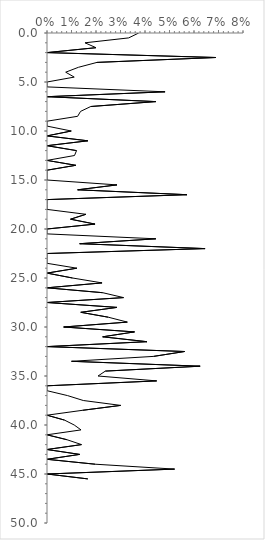
| Category | Series 0 |
|---|---|
| 0.0374331550802139 | 0 |
| 0.03333333333333333 | 0.5 |
| 0.015503875968992248 | 1 |
| 0.02 | 1.5 |
| 0.0 | 2 |
| 0.06896551724137931 | 2.5 |
| 0.02040816326530612 | 3 |
| 0.01282051282051282 | 3.5 |
| 0.007633587786259542 | 4 |
| 0.011111111111111112 | 4.5 |
| 0.0 | 5 |
| 0.0 | 5.5 |
| 0.04819277108433735 | 6 |
| 0.0 | 6.5 |
| 0.044444444444444446 | 7 |
| 0.017857142857142856 | 7.5 |
| 0.0136986301369863 | 8 |
| 0.0125 | 8.5 |
| 0.0 | 9 |
| 0.0 | 9.5 |
| 0.009900990099009901 | 10 |
| 0.0 | 10.5 |
| 0.016666666666666666 | 11 |
| 0.0 | 11.5 |
| 0.012048192771084338 | 12 |
| 0.011235955056179775 | 12.5 |
| 0.0 | 13 |
| 0.011764705882352941 | 13.5 |
| 0.0 | 14 |
| 0.0 | 14.5 |
| 0.0 | 15 |
| 0.02857142857142857 | 15.5 |
| 0.0125 | 16 |
| 0.05714285714285714 | 16.5 |
| 0.0 | 17 |
| 0.0 | 17.5 |
| 0.0 | 18 |
| 0.015873015873015872 | 18.5 |
| 0.009615384615384616 | 19 |
| 0.0196078431372549 | 19.5 |
| 0.0 | 20 |
| 0.0 | 20.5 |
| 0.044444444444444446 | 21 |
| 0.013333333333333334 | 21.5 |
| 0.06451612903225806 | 22 |
| 0.0 | 22.5 |
| 0.0 | 23 |
| 0.0 | 23.5 |
| 0.012195121951219513 | 24 |
| 0.0 | 24.5 |
| 0.010416666666666666 | 25 |
| 0.02247191011235955 | 25.5 |
| 0.0 | 26 |
| 0.022727272727272728 | 26.5 |
| 0.03125 | 27 |
| 0.0 | 27.5 |
| 0.02857142857142857 | 28 |
| 0.013793103448275862 | 28.5 |
| 0.025 | 29 |
| 0.03278688524590164 | 29.5 |
| 0.006802721088435374 | 30 |
| 0.03571428571428571 | 30.5 |
| 0.022727272727272728 | 31 |
| 0.04081632653061224 | 31.5 |
| 0.0 | 32 |
| 0.056179775280898875 | 32.5 |
| 0.043478260869565216 | 33 |
| 0.01 | 33.5 |
| 0.0625 | 34 |
| 0.023809523809523808 | 34.5 |
| 0.020833333333333332 | 35 |
| 0.04477611940298507 | 35.5 |
| 0.0 | 36 |
| 0.0 | 36.5 |
| 0.008403361344537815 | 37 |
| 0.014814814814814815 | 37.5 |
| 0.03007518796992481 | 38 |
| 0.014492753623188406 | 38.5 |
| 0.0 | 39 |
| 0.007142857142857143 | 39.5 |
| 0.011111111111111112 | 40 |
| 0.013888888888888888 | 40.5 |
| 0.0 | 41 |
| 0.008130081300813009 | 41.5 |
| 0.014084507042253521 | 42 |
| 0.0 | 42.5 |
| 0.013333333333333334 | 43 |
| 0.0 | 43.5 |
| 0.0196078431372549 | 44 |
| 0.052083333333333336 | 44.5 |
| 0.0 | 45 |
| 0.016666666666666666 | 45.5 |